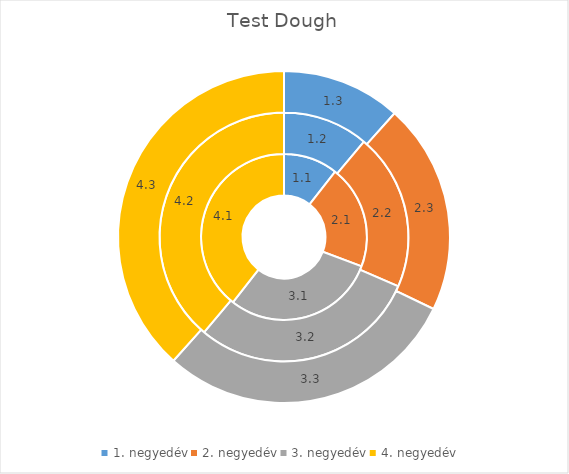
| Category | Oszlop1 | Oszlop2 | Oszlop3 |
|---|---|---|---|
| 1. negyedév | 1.1 | 1.2 | 1.3 |
| 2. negyedév | 2.1 | 2.2 | 2.3 |
| 3. negyedév | 3.1 | 3.2 | 3.3 |
| 4. negyedév | 4.1 | 4.2 | 4.3 |